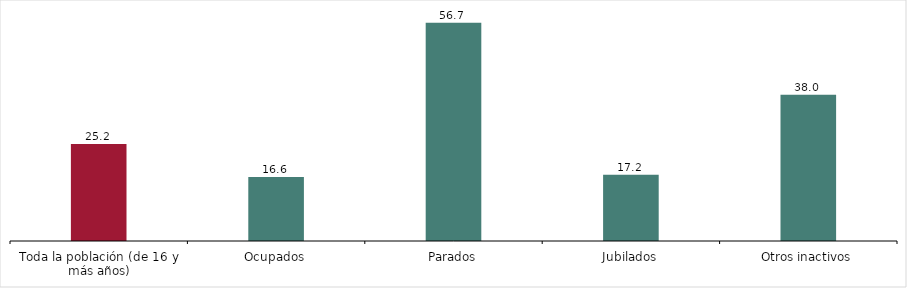
| Category | Por relación con la actividad |
|---|---|
| Toda la población (de 16 y más años) | 25.2 |
| Ocupados | 16.6 |
| Parados | 56.7 |
| Jubilados | 17.2 |
| Otros inactivos | 38 |